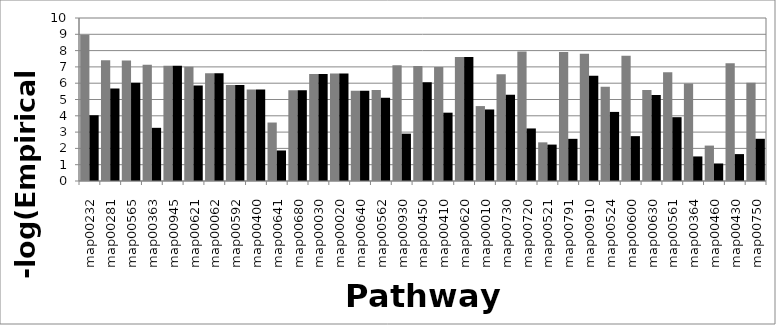
| Category | Series 0 | Series 1 |
|---|---|---|
| map00232 | 8.972 | 4.034 |
| map00281 | 7.403 | 5.671 |
| map00565 | 7.39 | 6.028 |
| map00363 | 7.132 | 3.263 |
| map00945 | 7.068 | 7.068 |
| map00621 | 7.004 | 5.858 |
| map00062 | 6.618 | 6.618 |
| map00592 | 5.896 | 5.896 |
| map00400 | 5.615 | 5.615 |
| map00641 | 3.588 | 1.873 |
| map00680 | 5.566 | 5.566 |
| map00030 | 6.563 | 6.563 |
| map00020 | 6.591 | 6.591 |
| map00640 | 5.539 | 5.539 |
| map00562 | 5.584 | 5.107 |
| map00930 | 7.099 | 2.904 |
| map00450 | 7.061 | 6.061 |
| map00410 | 6.999 | 4.192 |
| map00620 | 7.6 | 7.6 |
| map00010 | 4.596 | 4.389 |
| map00730 | 6.544 | 5.292 |
| map00720 | 7.945 | 3.224 |
| map00521 | 2.371 | 2.234 |
| map00791 | 7.919 | 2.587 |
| map00910 | 7.803 | 6.461 |
| map00524 | 5.783 | 4.239 |
| map00600 | 7.686 | 2.751 |
| map00630 | 5.576 | 5.275 |
| map00561 | 6.667 | 3.915 |
| map00364 | 5.986 | 1.507 |
| map00460 | 2.173 | 1.075 |
| map00430 | 7.221 | 1.65 |
| map00750 | 6.022 | 2.589 |